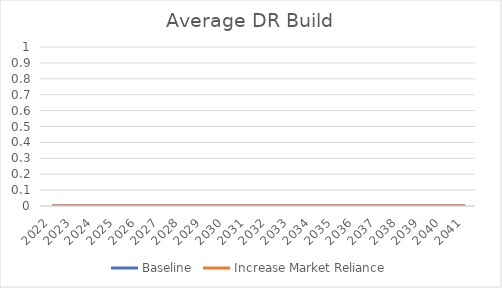
| Category | Baseline | Increase Market Reliance |
|---|---|---|
| 2022.0 | 0 | 0 |
| 2023.0 | 0 | 0 |
| 2024.0 | 0 | 0 |
| 2025.0 | 0 | 0 |
| 2026.0 | 0 | 0 |
| 2027.0 | 0 | 0 |
| 2028.0 | 0 | 0 |
| 2029.0 | 0 | 0 |
| 2030.0 | 0 | 0 |
| 2031.0 | 0 | 0 |
| 2032.0 | 0 | 0 |
| 2033.0 | 0 | 0 |
| 2034.0 | 0 | 0 |
| 2035.0 | 0 | 0 |
| 2036.0 | 0 | 0 |
| 2037.0 | 0 | 0 |
| 2038.0 | 0 | 0 |
| 2039.0 | 0 | 0 |
| 2040.0 | 0 | 0 |
| 2041.0 | 0 | 0 |